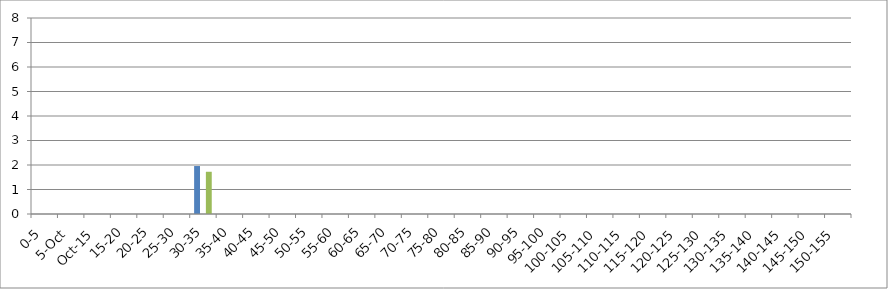
| Category | UNION_ALL | INTERSECTION_ALL | UNION(INTERSECTION_119875_146067,INTERSECTION_119875_241240,INTERSECTION_146067_241240) |
|---|---|---|---|
| 0-5 | 0 | 0 | 0 |
| 5-Oct | 0 | 0 | 0 |
| Oct-15 | 0 | 0 | 0 |
| 15-20 | 0 | 0 | 0 |
| 20-25 | 0 | 0 | 0 |
| 25-30 | 0 | 0 | 0 |
| 30-35 | 1.958 | 0 | 1.724 |
| 35-40 | 0 | 0 | 0 |
| 40-45 | 0 | 0 | 0 |
| 45-50 | 0 | 0 | 0 |
| 50-55 | 0 | 0 | 0 |
| 55-60 | 0 | 0 | 0 |
| 60-65 | 0 | 0 | 0 |
| 65-70 | 0 | 0 | 0 |
| 70-75 | 0 | 0 | 0 |
| 75-80 | 0 | 0 | 0 |
| 80-85 | 0 | 0 | 0 |
| 85-90 | 0 | 0 | 0 |
| 90-95 | 0 | 0 | 0 |
| 95-100 | 0 | 0 | 0 |
| 100-105 | 0 | 0 | 0 |
| 105-110 | 0 | 0 | 0 |
| 110-115 | 0 | 0 | 0 |
| 115-120 | 0 | 0 | 0 |
| 120-125 | 0 | 0 | 0 |
| 125-130 | 0 | 0 | 0 |
| 130-135 | 0 | 0 | 0 |
| 135-140 | 0 | 0 | 0 |
| 140-145 | 0 | 0 | 0 |
| 145-150 | 0 | 0 | 0 |
| 150-155 | 0 | 0 | 0 |